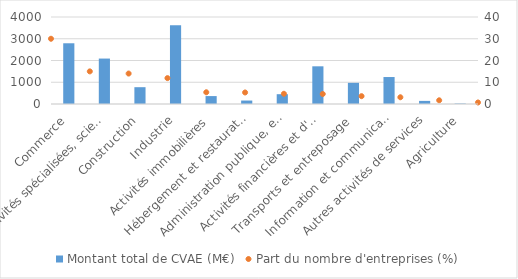
| Category | Montant total de CVAE (M€) |
|---|---|
| Commerce | 2792 |
| Activités spécialisées, scientifiques, techniques et de soutien | 2089 |
| Construction | 773 |
| Industrie | 3623 |
| Activités immobilières | 364 |
| Hébergement et restauration | 159 |
| Administration publique, enseignement, santé humaine et action sociale | 451 |
| Activités financières et d'assurance | 1733 |
| Transports et entreposage | 973 |
| Information et communication | 1240 |
| Autres activités de services | 143 |
| Agriculture | 21 |